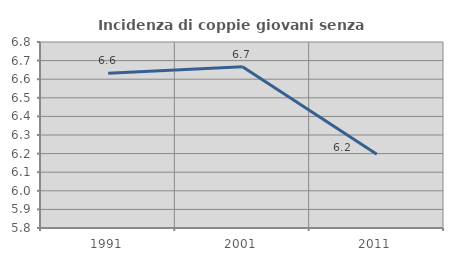
| Category | Incidenza di coppie giovani senza figli |
|---|---|
| 1991.0 | 6.632 |
| 2001.0 | 6.667 |
| 2011.0 | 6.196 |